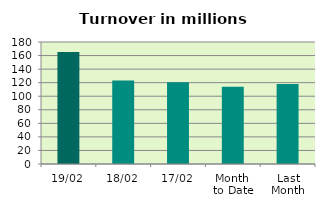
| Category | Series 0 |
|---|---|
| 19/02 | 165.202 |
| 18/02 | 123.014 |
| 17/02 | 120.747 |
| Month 
to Date | 113.934 |
| Last
Month | 118.136 |